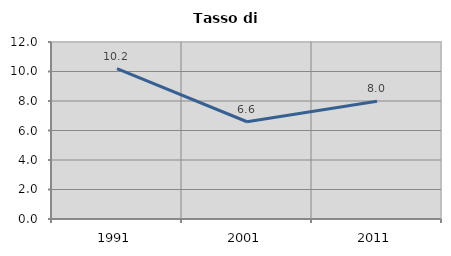
| Category | Tasso di disoccupazione   |
|---|---|
| 1991.0 | 10.195 |
| 2001.0 | 6.593 |
| 2011.0 | 7.982 |